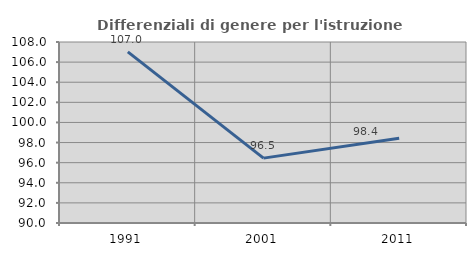
| Category | Differenziali di genere per l'istruzione superiore |
|---|---|
| 1991.0 | 107.015 |
| 2001.0 | 96.452 |
| 2011.0 | 98.418 |